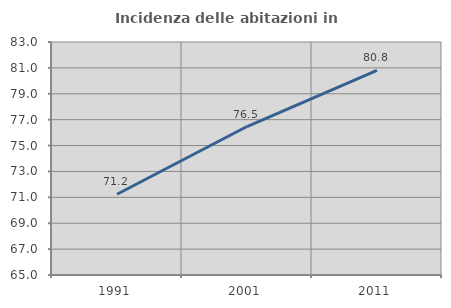
| Category | Incidenza delle abitazioni in proprietà  |
|---|---|
| 1991.0 | 71.241 |
| 2001.0 | 76.471 |
| 2011.0 | 80.814 |